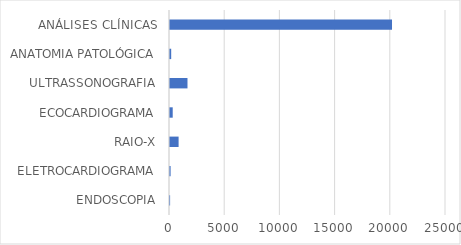
| Category | Series 0 |
|---|---|
| ENDOSCOPIA | 9 |
| ELETROCARDIOGRAMA | 55 |
| RAIO-X | 779 |
| ECOCARDIOGRAMA | 246 |
| ULTRASSONOGRAFIA | 1584 |
| ANATOMIA PATOLÓGICA | 108 |
| ANÁLISES CLÍNICAS | 20110 |